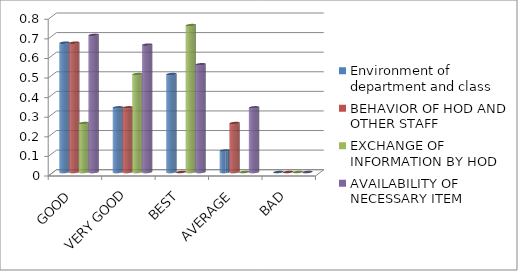
| Category | Environment of department and class | BEHAVIOR OF HOD AND OTHER STAFF | EXCHANGE OF INFORMATION BY HOD | AVAILABILITY OF NECESSARY ITEM |
|---|---|---|---|---|
| GOOD | 0.66 | 0.66 | 0.25 | 0.7 |
| VERY GOOD | 0.33 | 0.33 | 0.5 | 0.65 |
| BEST | 0.5 | 0 | 0.75 | 0.55 |
| AVERAGE | 0.11 | 0.25 | 0 | 0.33 |
| BAD | 0 | 0 | 0 | 0 |